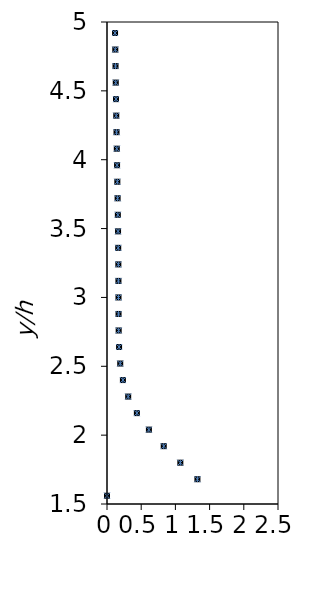
| Category | Ri=1* |
|---|---|
| 0.0 | 0 |
| 0.560660008684325 | 0.12 |
| 0.879328461488714 | 0.24 |
| 1.0807799632302 | 0.36 |
| 1.18879788619839 | 0.48 |
| 1.21650139965448 | 0.6 |
| 1.19383080348482 | 0.72 |
| 1.19683920141167 | 0.84 |
| 1.34905065548175 | 0.96 |
| 1.63486974436674 | 1.08 |
| 1.90592888092313 | 1.2 |
| 1.93029820493159 | 1.32 |
| 1.78741349396255 | 1.44 |
| 1.0 | 1.56 |
| 2.0 | 1.68 |
| 3.0 | 1.8 |
| 4.0 | 1.92 |
| 5.0 | 2.04 |
| 6.0 | 2.16 |
| 7.0 | 2.28 |
| 8.0 | 2.4 |
| 9.0 | 2.52 |
| 10.0 | 2.64 |
| 11.0 | 2.76 |
| 12.0 | 2.88 |
| 13.0 | 3 |
| 14.0 | 3.12 |
| 15.0 | 3.24 |
| 16.0 | 3.36 |
| 17.0 | 3.48 |
| 18.0 | 3.6 |
| 19.0 | 3.72 |
| 20.0 | 3.84 |
| 21.0 | 3.96 |
| 22.0 | 4.08 |
| 23.0 | 4.2 |
| 24.0 | 4.32 |
| 25.0 | 4.44 |
| 26.0 | 4.56 |
| 27.0 | 4.68 |
| 28.0 | 4.8 |
| 29.0 | 4.92 |
| 30.0 | 5.04 |
| 31.0 | 5.16 |
| 32.0 | 5.28 |
| 33.0 | 5.4 |
| 34.0 | 5.52 |
| 35.0 | 5.64 |
| 36.0 | 5.76 |
| 37.0 | 5.88 |
| 38.0 | 6 |
| 39.0 | 6.12 |
| 40.0 | 6.24 |
| 41.0 | 6.36 |
| 42.0 | 6.48 |
| 43.0 | 6.6 |
| 44.0 | 6.72 |
| 45.0 | 6.84 |
| 46.0 | 6.96 |
| 47.0 | 7.08 |
| 48.0 | 7.2 |
| 49.0 | 7.32 |
| 50.0 | 7.44 |
| 51.0 | 7.56 |
| 52.0 | 7.68 |
| 53.0 | 7.8 |
| 54.0 | 7.92 |
| 55.0 | 8.04 |
| 56.0 | 8.16 |
| 57.0 | 8.28 |
| 58.0 | 8.4 |
| 59.0 | 8.52 |
| 60.0 | 8.64 |
| 61.0 | 8.76 |
| 62.0 | 8.88 |
| 63.0 | 9 |
| 64.0 | 9.12 |
| 65.0 | 9.24 |
| 66.0 | 9.36 |
| 67.0 | 9.48 |
| 68.0 | 9.6 |
| 69.0 | 9.72 |
| 70.0 | 9.84 |
| 71.0 | 9.96 |
| 72.0 | 10.08 |
| 73.0 | 10.2 |
| 74.0 | 10.32 |
| 75.0 | 10.44 |
| 76.0 | 10.56 |
| 77.0 | 10.68 |
| 78.0 | 10.8 |
| 79.0 | 10.92 |
| 80.0 | 11.04 |
| 81.0 | 11.16 |
| 82.0 | 11.28 |
| 83.0 | 11.4 |
| 84.0 | 11.52 |
| 85.0 | 11.64 |
| 86.0 | 11.76 |
| 87.0 | 11.88 |
| 88.0 | 12 |